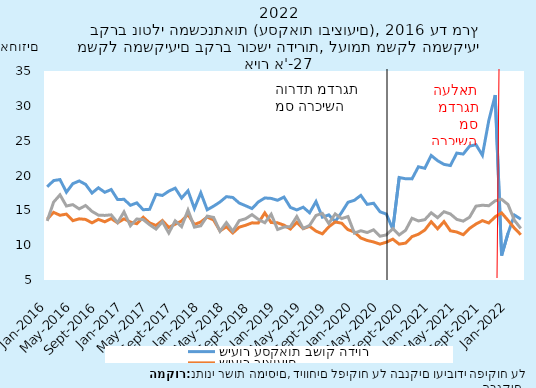
| Category | שיעור עסקאות בשוק הדיור | שיעור ביצועים | שיעור עסקאות |
|---|---|---|---|
| 2016-01-01 | 18.376 | 13.739 | 13.473 |
| 2016-02-01 | 19.269 | 14.709 | 16.179 |
| 2016-03-01 | 19.418 | 14.292 | 17.225 |
| 2016-04-01 | 17.604 | 14.455 | 15.621 |
| 2016-05-01 | 18.826 | 13.515 | 15.818 |
| 2016-06-01 | 19.22 | 13.779 | 15.205 |
| 2016-07-01 | 18.723 | 13.695 | 15.692 |
| 2016-08-01 | 17.481 | 13.203 | 14.851 |
| 2016-09-01 | 18.236 | 13.703 | 14.307 |
| 2016-10-01 | 17.586 | 13.357 | 14.271 |
| 2016-11-01 | 17.991 | 13.81 | 14.348 |
| 2016-12-01 | 16.543 | 13.213 | 13.229 |
| 2017-01-01 | 16.583 | 13.772 | 14.772 |
| 2017-02-01 | 15.722 | 13.32 | 12.787 |
| 2017-03-01 | 16.072 | 13.077 | 13.755 |
| 2017-04-01 | 15.089 | 14.012 | 13.672 |
| 2017-05-01 | 15.142 | 13.201 | 12.936 |
| 2017-06-01 | 17.302 | 12.82 | 12.311 |
| 2017-07-01 | 17.132 | 13.539 | 13.363 |
| 2017-08-01 | 17.758 | 12.539 | 11.745 |
| 2017-09-01 | 18.185 | 13.013 | 13.491 |
| 2017-10-01 | 16.765 | 13.474 | 12.656 |
| 2017-11-01 | 17.807 | 14.381 | 15.027 |
| 2017-12-01 | 15.258 | 12.969 | 12.586 |
| 2018-01-01 | 17.515 | 13.325 | 12.781 |
| 2018-02-01 | 15.081 | 14.034 | 14.171 |
| 2018-03-01 | 15.6 | 13.615 | 13.984 |
| 2018-04-01 | 16.199 | 12.045 | 11.993 |
| 2018-05-01 | 16.965 | 12.643 | 13.235 |
| 2018-06-01 | 16.846 | 11.754 | 11.998 |
| 2018-07-01 | 16.047 | 12.582 | 13.524 |
| 2018-08-01 | 15.657 | 12.857 | 13.794 |
| 2018-09-01 | 15.254 | 13.2 | 14.384 |
| 2018-10-01 | 16.21 | 13.196 | 13.697 |
| 2018-11-01 | 16.775 | 14.635 | 13.218 |
| 2018-12-01 | 16.712 | 13.246 | 14.439 |
| 2019-01-01 | 16.44 | 13.202 | 12.252 |
| 2019-02-01 | 16.899 | 12.873 | 12.597 |
| 2019-03-01 | 15.42 | 12.32 | 12.659 |
| 2019-04-01 | 15.057 | 13.28 | 14.109 |
| 2019-05-01 | 15.447 | 12.371 | 12.393 |
| 2019-06-01 | 14.649 | 12.706 | 12.844 |
| 2019-07-01 | 16.265 | 12.014 | 14.263 |
| 2019-08-01 | 14.014 | 11.624 | 14.559 |
| 2019-09-01 | 14.348 | 12.632 | 13.107 |
| 2019-10-01 | 13.378 | 13.336 | 14.487 |
| 2019-11-01 | 14.692 | 13.152 | 13.818 |
| 2019-12-01 | 16.154 | 12.228 | 14.104 |
| 2020-01-01 | 16.448 | 11.893 | 11.726 |
| 2020-02-01 | 17.144 | 11.03 | 12.07 |
| 2020-03-01 | 15.856 | 10.672 | 11.815 |
| 2020-04-01 | 16.021 | 10.461 | 12.207 |
| 2020-05-01 | 14.792 | 10.151 | 11.283 |
| 2020-06-01 | 14.459 | 10.43 | 11.472 |
| 2020-07-01 | 12.284 | 10.866 | 12.373 |
| 2020-08-01 | 19.713 | 10.149 | 11.471 |
| 2020-09-01 | 19.528 | 10.299 | 12.133 |
| 2020-10-01 | 19.516 | 11.226 | 13.864 |
| 2020-11-01 | 21.253 | 11.57 | 13.478 |
| 2020-12-01 | 21.036 | 12.168 | 13.659 |
| 2021-01-01 | 22.873 | 13.363 | 14.651 |
| 2021-02-01 | 22.126 | 12.357 | 13.945 |
| 2021-03-01 | 21.595 | 13.388 | 14.803 |
| 2021-04-01 | 21.429 | 12.065 | 14.481 |
| 2021-05-01 | 23.218 | 11.888 | 13.701 |
| 2021-06-01 | 23.078 | 11.504 | 13.45 |
| 2021-07-01 | 24.214 | 12.409 | 14.017 |
| 2021-08-01 | 24.419 | 13.039 | 15.604 |
| 2021-09-01 | 22.902 | 13.518 | 15.733 |
| 2021-10-01 | 27.899 | 13.181 | 15.662 |
| 2021-11-01 | 31.537 | 14.076 | 16.367 |
| 2021-12-01 | 8.509 | 14.628 | 16.585 |
| 2022-01-01 | 11.687 | 13.567 | 15.838 |
| 2022-02-01 | 14.325 | 12.447 | 13.57 |
| 2022-03-01 | 13.737 | 11.5 | 12.4 |